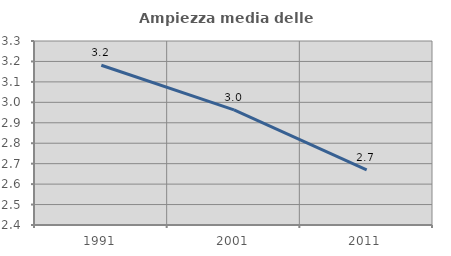
| Category | Ampiezza media delle famiglie |
|---|---|
| 1991.0 | 3.181 |
| 2001.0 | 2.963 |
| 2011.0 | 2.67 |